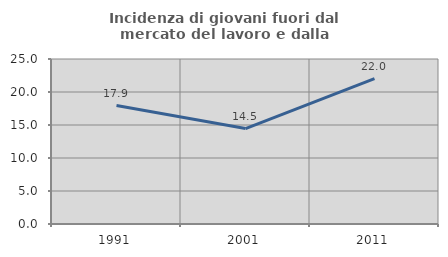
| Category | Incidenza di giovani fuori dal mercato del lavoro e dalla formazione  |
|---|---|
| 1991.0 | 17.949 |
| 2001.0 | 14.458 |
| 2011.0 | 22.034 |